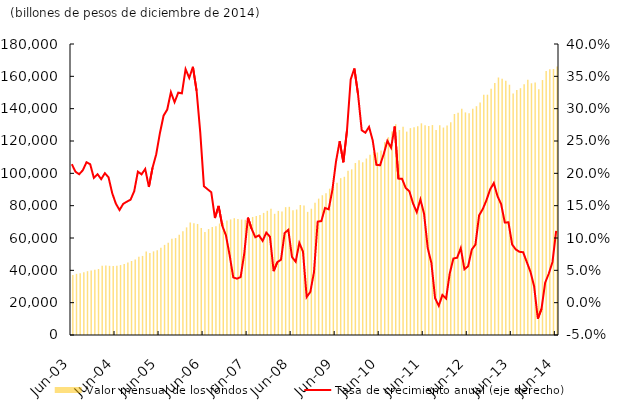
| Category | Valor mensual de los fondos |
|---|---|
| 2002-01-01 | 27175.54 |
| 2002-02-01 | 28957.619 |
| 2002-03-01 | 28983.254 |
| 2002-04-01 | 29174.94 |
| 2002-05-01 | 29743.655 |
| 2002-06-01 | 30577.728 |
| 2002-07-01 | 31460.925 |
| 2002-08-01 | 31811.145 |
| 2002-09-01 | 32215.244 |
| 2002-10-01 | 32438.066 |
| 2002-11-01 | 32852.533 |
| 2002-12-01 | 33768.542 |
| 2003-01-01 | 34044.732 |
| 2003-02-01 | 35905.609 |
| 2003-03-01 | 35798.955 |
| 2003-04-01 | 35844.991 |
| 2003-05-01 | 36445.332 |
| 2003-06-01 | 37123.325 |
| 2003-07-01 | 37830.787 |
| 2003-08-01 | 38129.706 |
| 2003-09-01 | 38813.286 |
| 2003-10-01 | 39482.459 |
| 2003-11-01 | 39885.704 |
| 2003-12-01 | 40285.995 |
| 2004-01-01 | 40809.462 |
| 2004-02-01 | 42762.484 |
| 2004-03-01 | 42966.023 |
| 2004-04-01 | 42794.232 |
| 2004-05-01 | 42619.971 |
| 2004-06-01 | 42808.472 |
| 2004-07-01 | 43249.291 |
| 2004-08-01 | 43955.424 |
| 2004-09-01 | 44875.877 |
| 2004-10-01 | 45769.311 |
| 2004-11-01 | 46759.223 |
| 2004-12-01 | 48447.111 |
| 2005-01-01 | 48907.09 |
| 2005-02-01 | 51602.846 |
| 2005-03-01 | 50653.49 |
| 2005-04-01 | 51729.698 |
| 2005-05-01 | 52398.68 |
| 2005-06-01 | 54027.957 |
| 2005-07-01 | 55751.772 |
| 2005-08-01 | 57082.253 |
| 2005-09-01 | 59489.48 |
| 2005-10-01 | 59954.423 |
| 2005-11-01 | 61943.846 |
| 2005-12-01 | 64133.896 |
| 2006-01-01 | 66571.219 |
| 2006-02-01 | 69534.747 |
| 2006-03-01 | 69129.629 |
| 2006-04-01 | 68680.615 |
| 2006-05-01 | 66202.585 |
| 2006-06-01 | 63761.831 |
| 2006-07-01 | 65528.021 |
| 2006-08-01 | 66834.366 |
| 2006-09-01 | 67276.871 |
| 2006-10-01 | 68926.252 |
| 2006-11-01 | 69314.769 |
| 2006-12-01 | 70810.344 |
| 2007-01-01 | 71475.411 |
| 2007-02-01 | 72251.461 |
| 2007-03-01 | 71694.114 |
| 2007-04-01 | 71394.679 |
| 2007-05-01 | 71250.685 |
| 2007-06-01 | 72145.537 |
| 2007-07-01 | 73010.216 |
| 2007-08-01 | 73601.684 |
| 2007-09-01 | 74280.901 |
| 2007-10-01 | 75515.464 |
| 2007-11-01 | 76822.067 |
| 2007-12-01 | 78032.578 |
| 2008-01-01 | 74960.813 |
| 2008-02-01 | 76771.791 |
| 2008-03-01 | 76457.468 |
| 2008-04-01 | 79084.365 |
| 2008-05-01 | 79275.064 |
| 2008-06-01 | 77239.203 |
| 2008-07-01 | 77634.322 |
| 2008-08-01 | 80406.898 |
| 2008-09-01 | 80135.503 |
| 2008-10-01 | 76169.227 |
| 2008-11-01 | 78101.885 |
| 2008-12-01 | 81733.213 |
| 2009-01-01 | 84357.415 |
| 2009-02-01 | 86452.57 |
| 2009-03-01 | 87653.046 |
| 2009-04-01 | 90502.708 |
| 2009-05-01 | 93070.096 |
| 2009-06-01 | 94105.222 |
| 2009-07-01 | 97012.948 |
| 2009-08-01 | 97865.589 |
| 2009-09-01 | 101530.702 |
| 2009-10-01 | 102473.715 |
| 2009-11-01 | 106382.402 |
| 2009-12-01 | 108073.028 |
| 2010-01-01 | 106847.644 |
| 2010-02-01 | 109173.457 |
| 2010-03-01 | 111476.782 |
| 2010-04-01 | 113209.011 |
| 2010-05-01 | 112905.826 |
| 2010-06-01 | 114100.841 |
| 2010-07-01 | 119296.486 |
| 2010-08-01 | 122357.615 |
| 2010-09-01 | 125861.739 |
| 2010-10-01 | 130387.368 |
| 2010-11-01 | 126790.5 |
| 2010-12-01 | 128768.996 |
| 2011-01-01 | 125801.033 |
| 2011-02-01 | 127960.331 |
| 2011-03-01 | 128570.855 |
| 2011-04-01 | 129059.016 |
| 2011-05-01 | 130928.196 |
| 2011-06-01 | 129779.727 |
| 2011-07-01 | 129349.642 |
| 2011-08-01 | 129856.651 |
| 2011-09-01 | 126732.608 |
| 2011-10-01 | 129754.291 |
| 2011-11-01 | 128311.369 |
| 2011-12-01 | 129596.955 |
| 2012-01-01 | 131525.853 |
| 2012-02-01 | 136695.067 |
| 2012-03-01 | 137505.773 |
| 2012-04-01 | 139950.839 |
| 2012-05-01 | 137687.927 |
| 2012-06-01 | 137099.929 |
| 2012-07-01 | 139959.545 |
| 2012-08-01 | 141524.417 |
| 2012-09-01 | 143844.468 |
| 2012-10-01 | 148540.615 |
| 2012-11-01 | 148643.26 |
| 2012-12-01 | 152294.078 |
| 2013-01-01 | 155849.958 |
| 2013-02-01 | 159239.401 |
| 2013-03-01 | 158460.996 |
| 2013-04-01 | 157293.089 |
| 2013-05-01 | 154799.616 |
| 2013-06-01 | 149435.273 |
| 2013-07-01 | 151473.86 |
| 2013-08-01 | 152652.018 |
| 2013-09-01 | 155063.027 |
| 2013-10-01 | 157865.154 |
| 2013-11-01 | 155712.083 |
| 2013-12-01 | 156118.35 |
| 2014-01-01 | 151981.791 |
| 2014-02-01 | 157697.654 |
| 2014-03-01 | 163360.422 |
| 2014-04-01 | 164385.864 |
| 2014-05-01 | 164543.325 |
| 2014-06-01 | 166030.062 |